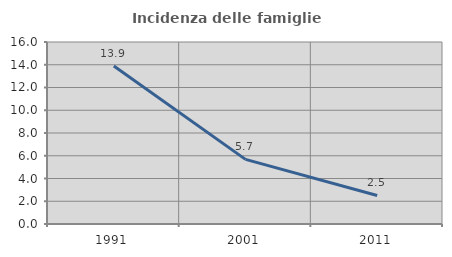
| Category | Incidenza delle famiglie numerose |
|---|---|
| 1991.0 | 13.894 |
| 2001.0 | 5.68 |
| 2011.0 | 2.506 |